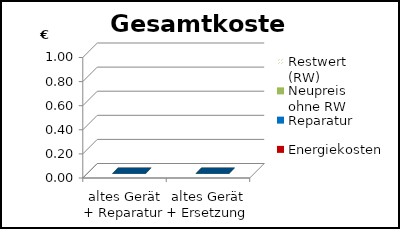
| Category | Energiekosten | Reparatur | Neupreis ohne RW | Restwert (RW) |
|---|---|---|---|---|
| altes Gerät + Reparatur | 0 | 0 | 0 | 0 |
| altes Gerät + Ersetzung | 0 | 0 | 0 | 0 |